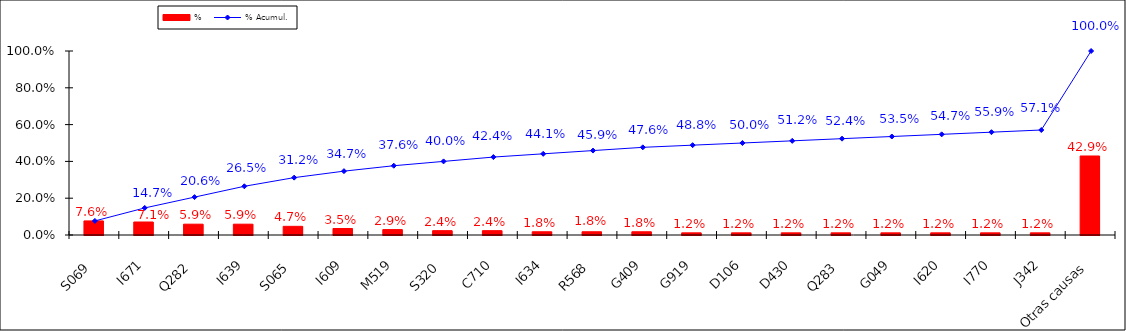
| Category | % |
|---|---|
| S069 | 0.076 |
| I671 | 0.071 |
| Q282 | 0.059 |
| I639 | 0.059 |
| S065 | 0.047 |
| I609 | 0.035 |
| M519 | 0.029 |
| S320 | 0.024 |
| C710 | 0.024 |
| I634 | 0.018 |
| R568 | 0.018 |
| G409 | 0.018 |
| G919 | 0.012 |
| D106 | 0.012 |
| D430 | 0.012 |
| Q283 | 0.012 |
| G049 | 0.012 |
| I620 | 0.012 |
| I770 | 0.012 |
| J342 | 0.012 |
| Otras causas | 0.429 |